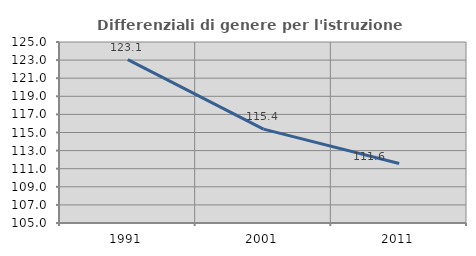
| Category | Differenziali di genere per l'istruzione superiore |
|---|---|
| 1991.0 | 123.061 |
| 2001.0 | 115.369 |
| 2011.0 | 111.581 |